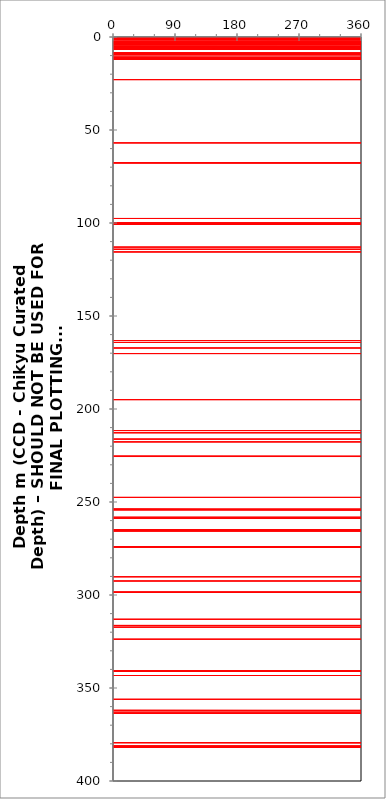
| Category | Series 0 |
|---|---|
| -10.0 | 0.08 |
| 360.0 | 0.08 |
| -10.0 | 0.08 |
| -10.0 | 0.26 |
| 360.0 | 0.26 |
| -10.0 | 0.26 |
| -10.0 | 0.3 |
| 360.0 | 0.3 |
| -10.0 | 0.3 |
| -10.0 | 0.7 |
| 360.0 | 0.7 |
| -10.0 | 0.7 |
| -10.0 | 0.77 |
| 360.0 | 0.77 |
| -10.0 | 0.77 |
| -10.0 | 1.35 |
| 360.0 | 1.35 |
| -10.0 | 1.35 |
| -10.0 | 1.485 |
| 360.0 | 1.485 |
| -10.0 | 1.485 |
| -10.0 | 1.535 |
| 360.0 | 1.535 |
| -10.0 | 1.535 |
| -10.0 | 2.65 |
| 360.0 | 2.65 |
| -10.0 | 2.65 |
| -10.0 | 2.73 |
| 360.0 | 2.73 |
| -10.0 | 2.73 |
| -10.0 | 2.75 |
| 360.0 | 2.75 |
| -10.0 | 2.75 |
| -10.0 | 2.9 |
| 360.0 | 2.9 |
| -10.0 | 2.9 |
| -10.0 | 3.05 |
| 360.0 | 3.05 |
| -10.0 | 3.05 |
| -10.0 | 3.14 |
| 360.0 | 3.14 |
| -10.0 | 3.14 |
| -10.0 | 3.2 |
| 360.0 | 3.2 |
| -10.0 | 3.2 |
| -10.0 | 3.46 |
| 360.0 | 3.46 |
| -10.0 | 3.46 |
| -10.0 | 3.48 |
| 360.0 | 3.48 |
| -10.0 | 3.48 |
| -10.0 | 3.84 |
| 360.0 | 3.84 |
| -10.0 | 3.84 |
| -10.0 | 4.04 |
| 360.0 | 4.04 |
| -10.0 | 4.04 |
| -10.0 | 4.92 |
| 360.0 | 4.92 |
| -10.0 | 4.92 |
| -10.0 | 5.05 |
| 360.0 | 5.05 |
| -10.0 | 5.05 |
| -10.0 | 5.05 |
| 360.0 | 5.05 |
| -10.0 | 5.05 |
| -10.0 | 5.11 |
| 360.0 | 5.11 |
| -10.0 | 5.11 |
| -10.0 | 5.19 |
| 360.0 | 5.19 |
| -10.0 | 5.19 |
| -10.0 | 5.45 |
| 360.0 | 5.45 |
| -10.0 | 5.45 |
| -10.0 | 5.66 |
| 360.0 | 5.66 |
| -10.0 | 5.66 |
| -10.0 | 5.77 |
| 360.0 | 5.77 |
| -10.0 | 5.77 |
| -10.0 | 5.99 |
| 360.0 | 5.99 |
| -10.0 | 5.99 |
| -10.0 | 6.46 |
| 360.0 | 6.46 |
| -10.0 | 6.46 |
| -10.0 | 6.63 |
| 360.0 | 6.63 |
| -10.0 | 6.63 |
| -10.0 | 6.65 |
| 360.0 | 6.65 |
| -10.0 | 6.65 |
| -10.0 | 8.53 |
| 360.0 | 8.53 |
| -10.0 | 8.53 |
| -10.0 | 8.9 |
| 360.0 | 8.9 |
| -10.0 | 8.9 |
| -10.0 | 9.5 |
| 360.0 | 9.5 |
| -10.0 | 9.5 |
| -10.0 | 9.54 |
| 360.0 | 9.54 |
| -10.0 | 9.54 |
| -10.0 | 10.835 |
| 360.0 | 10.835 |
| -10.0 | 10.835 |
| -10.0 | 11.2 |
| 360.0 | 11.2 |
| -10.0 | 11.2 |
| -10.0 | 11.53 |
| 360.0 | 11.53 |
| -10.0 | 11.53 |
| -10.0 | 11.585 |
| 360.0 | 11.585 |
| -10.0 | 11.585 |
| -10.0 | 11.8 |
| 360.0 | 11.8 |
| -10.0 | 11.8 |
| -10.0 | 11.85 |
| 360.0 | 11.85 |
| -10.0 | 11.85 |
| -10.0 | 11.9 |
| 360.0 | 11.9 |
| -10.0 | 11.9 |
| -10.0 | 12.08 |
| 360.0 | 12.08 |
| -10.0 | 12.08 |
| -10.0 | 22.915 |
| 360.0 | 22.915 |
| -10.0 | 22.915 |
| -10.0 | 56.925 |
| 360.0 | 56.925 |
| -10.0 | 56.925 |
| -10.0 | 67.58 |
| 360.0 | 67.58 |
| -10.0 | 67.58 |
| -10.0 | 67.685 |
| 360.0 | 67.685 |
| -10.0 | 67.685 |
| -10.0 | 97.57 |
| 360.0 | 97.57 |
| -10.0 | 97.57 |
| -10.0 | 99.93 |
| 360.0 | 99.93 |
| -10.0 | 99.93 |
| -10.0 | 100.3 |
| 360.0 | 100.3 |
| -10.0 | 100.3 |
| -10.0 | 100.56 |
| 360.0 | 100.56 |
| -10.0 | 100.56 |
| -10.0 | 100.76 |
| 360.0 | 100.76 |
| -10.0 | 100.76 |
| -10.0 | 112.96 |
| 360.0 | 112.96 |
| -10.0 | 112.96 |
| -10.0 | 114.11 |
| 360.0 | 114.11 |
| -10.0 | 114.11 |
| -10.0 | 115.55 |
| 360.0 | 115.55 |
| -10.0 | 115.55 |
| -10.0 | 163.175 |
| 360.0 | 163.175 |
| -10.0 | 163.175 |
| -10.0 | 164.2 |
| 360.0 | 164.2 |
| -10.0 | 164.2 |
| -10.0 | 167.2 |
| 360.0 | 167.2 |
| -10.0 | 167.2 |
| -10.0 | 170.2 |
| 360.0 | 170.2 |
| -10.0 | 170.2 |
| -10.0 | 194.96 |
| 360.0 | 194.96 |
| -10.0 | 194.96 |
| -10.0 | 211.59 |
| 360.0 | 211.59 |
| -10.0 | 211.59 |
| -10.0 | 212.775 |
| 360.0 | 212.775 |
| -10.0 | 212.775 |
| -10.0 | 216.185 |
| 360.0 | 216.185 |
| -10.0 | 216.185 |
| -10.0 | 217.675 |
| 360.0 | 217.675 |
| -10.0 | 217.675 |
| -10.0 | 225.4 |
| 360.0 | 225.4 |
| -10.0 | 225.4 |
| -10.0 | 225.55 |
| 360.0 | 225.55 |
| -10.0 | 225.55 |
| -10.0 | 247.53 |
| 360.0 | 247.53 |
| -10.0 | 247.53 |
| -10.0 | 253.835 |
| 360.0 | 253.835 |
| -10.0 | 253.835 |
| -10.0 | 254.315 |
| 360.0 | 254.315 |
| -10.0 | 254.315 |
| -10.0 | 258.2 |
| 360.0 | 258.2 |
| -10.0 | 258.2 |
| -10.0 | 258.765 |
| 360.0 | 258.765 |
| -10.0 | 258.765 |
| -10.0 | 265 |
| 360.0 | 265 |
| -10.0 | 265 |
| -10.0 | 265.02 |
| 360.0 | 265.02 |
| -10.0 | 265.02 |
| -10.0 | 265.4 |
| 360.0 | 265.4 |
| -10.0 | 265.4 |
| -10.0 | 265.47 |
| 360.0 | 265.47 |
| -10.0 | 265.47 |
| -10.0 | 265.5 |
| 360.0 | 265.5 |
| -10.0 | 265.5 |
| -10.0 | 273.935 |
| 360.0 | 273.935 |
| -10.0 | 273.935 |
| -10.0 | 274.105 |
| 360.0 | 274.105 |
| -10.0 | 274.105 |
| -10.0 | 274.255 |
| 360.0 | 274.255 |
| -10.0 | 274.255 |
| -10.0 | 290.2 |
| 360.0 | 290.2 |
| -10.0 | 290.2 |
| -10.0 | 292.47 |
| 360.0 | 292.47 |
| -10.0 | 292.47 |
| -10.0 | 298.5 |
| 360.0 | 298.5 |
| -10.0 | 298.5 |
| -10.0 | 298.52 |
| 360.0 | 298.52 |
| -10.0 | 298.52 |
| -10.0 | 313.05 |
| 360.0 | 313.05 |
| -10.0 | 313.05 |
| -10.0 | 316.365 |
| 360.0 | 316.365 |
| -10.0 | 316.365 |
| -10.0 | 317.28 |
| 360.0 | 317.28 |
| -10.0 | 317.28 |
| -10.0 | 323.77 |
| 360.0 | 323.77 |
| -10.0 | 323.77 |
| -10.0 | 340.67 |
| 360.0 | 340.67 |
| -10.0 | 340.67 |
| -10.0 | 340.97 |
| 360.0 | 340.97 |
| -10.0 | 340.97 |
| -10.0 | 341.1 |
| 360.0 | 341.1 |
| -10.0 | 341.1 |
| -10.0 | 343.285 |
| 360.0 | 343.285 |
| -10.0 | 343.285 |
| -10.0 | 356.075 |
| 360.0 | 356.075 |
| -10.0 | 356.075 |
| -10.0 | 362.035 |
| 360.0 | 362.035 |
| -10.0 | 362.035 |
| -10.0 | 362.145 |
| 360.0 | 362.145 |
| -10.0 | 362.145 |
| -10.0 | 362.265 |
| 360.0 | 362.265 |
| -10.0 | 362.265 |
| -10.0 | 363.5 |
| 360.0 | 363.5 |
| -10.0 | 363.5 |
| -10.0 | 363.57 |
| 360.0 | 363.57 |
| -10.0 | 363.57 |
| -10.0 | 379.32 |
| 360.0 | 379.32 |
| -10.0 | 379.32 |
| -10.0 | 379.44 |
| 360.0 | 379.44 |
| -10.0 | 379.44 |
| -10.0 | 381.29 |
| 360.0 | 381.29 |
| -10.0 | 381.29 |
| -10.0 | 381.33 |
| 360.0 | 381.33 |
| -10.0 | 381.33 |
| -10.0 | 381.44 |
| 360.0 | 381.44 |
| -10.0 | 381.44 |
| -10.0 | 381.68 |
| 360.0 | 381.68 |
| -10.0 | 381.68 |
| -10.0 | 381.82 |
| 360.0 | 381.82 |
| -10.0 | 381.82 |